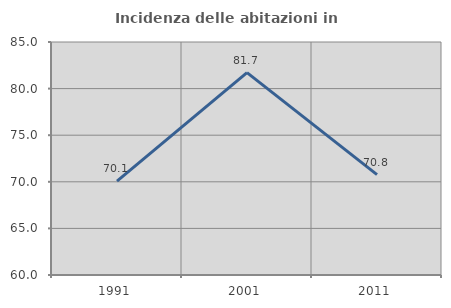
| Category | Incidenza delle abitazioni in proprietà  |
|---|---|
| 1991.0 | 70.081 |
| 2001.0 | 81.718 |
| 2011.0 | 70.777 |